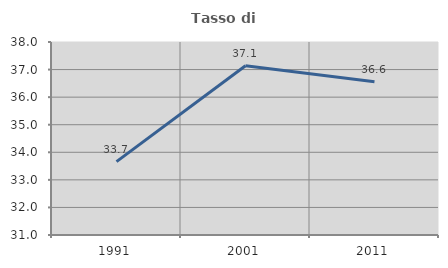
| Category | Tasso di occupazione   |
|---|---|
| 1991.0 | 33.66 |
| 2001.0 | 37.137 |
| 2011.0 | 36.556 |